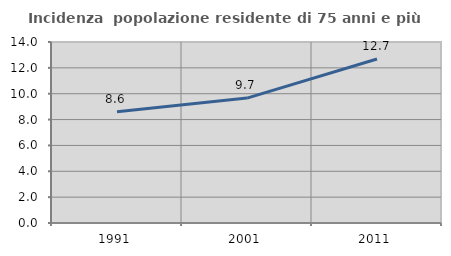
| Category | Incidenza  popolazione residente di 75 anni e più |
|---|---|
| 1991.0 | 8.607 |
| 2001.0 | 9.66 |
| 2011.0 | 12.682 |